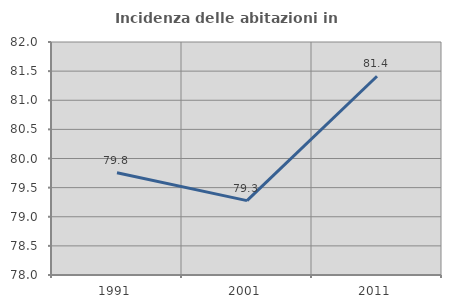
| Category | Incidenza delle abitazioni in proprietà  |
|---|---|
| 1991.0 | 79.755 |
| 2001.0 | 79.276 |
| 2011.0 | 81.413 |